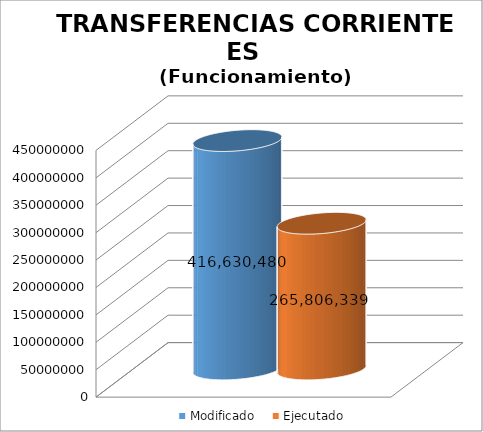
| Category | Modificado | Ejecutado |
|---|---|---|
| 0 | 416630480 | 265806339.46 |